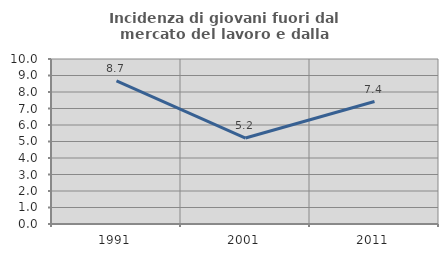
| Category | Incidenza di giovani fuori dal mercato del lavoro e dalla formazione  |
|---|---|
| 1991.0 | 8.675 |
| 2001.0 | 5.208 |
| 2011.0 | 7.422 |